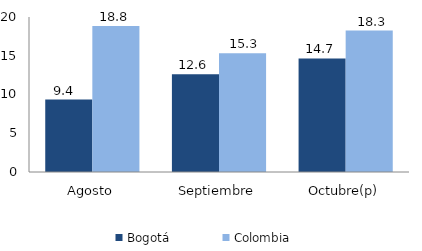
| Category | Bogotá | Colombia |
|---|---|---|
| Agosto | 9.351 | 18.828 |
| Septiembre | 12.624 | 15.328 |
| Octubre(p) | 14.651 | 18.252 |